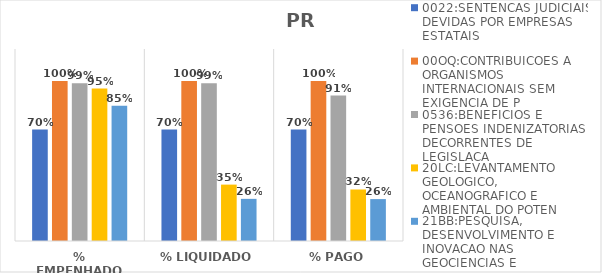
| Category | 0022:SENTENCAS JUDICIAIS DEVIDAS POR EMPRESAS ESTATAIS | 00OQ:CONTRIBUICOES A ORGANISMOS INTERNACIONAIS SEM EXIGENCIA DE P | 0536:BENEFICIOS E PENSOES INDENIZATORIAS DECORRENTES DE LEGISLACA | 20LC:LEVANTAMENTO GEOLOGICO, OCEANOGRAFICO E AMBIENTAL DO POTEN | 21BB:PESQUISA, DESENVOLVIMENTO E INOVACAO NAS GEOCIENCIAS E |
|---|---|---|---|---|---|
| % EMPENHADO | 0.697 | 1 | 0.985 | 0.953 | 0.846 |
| % LIQUIDADO | 0.697 | 1 | 0.985 | 0.352 | 0.263 |
| % PAGO | 0.697 | 1 | 0.909 | 0.322 | 0.262 |